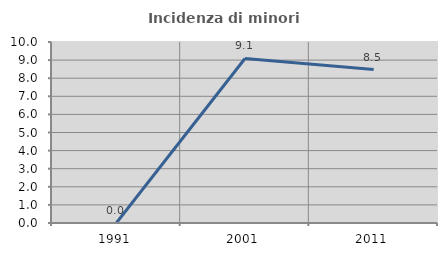
| Category | Incidenza di minori stranieri |
|---|---|
| 1991.0 | 0 |
| 2001.0 | 9.091 |
| 2011.0 | 8.475 |